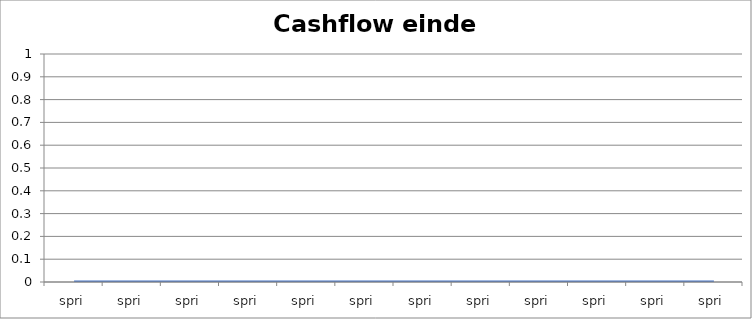
| Category | Eind Cumulatief |
|---|---|
| 0.0 | 0 |
| 0.0 | 0 |
| 0.0 | 0 |
| 0.0 | 0 |
| 0.0 | 0 |
| 0.0 | 0 |
| 0.0 | 0 |
| 0.0 | 0 |
| 0.0 | 0 |
| 0.0 | 0 |
| 0.0 | 0 |
| 0.0 | 0 |